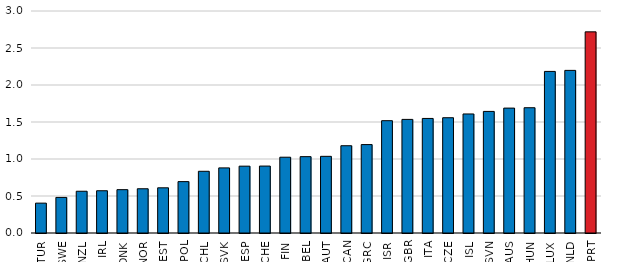
| Category | ARCR |
|---|---|
| TUR | 0.404 |
| SWE | 0.481 |
| NZL | 0.564 |
| IRL | 0.571 |
| DNK | 0.586 |
| NOR | 0.598 |
| EST | 0.611 |
| POL | 0.694 |
| CHL | 0.834 |
| SVK | 0.88 |
| ESP | 0.903 |
| CHE | 0.905 |
| FIN | 1.024 |
| BEL | 1.032 |
| AUT | 1.036 |
| CAN | 1.179 |
| GRC | 1.195 |
| ISR | 1.518 |
| GBR | 1.535 |
| ITA | 1.548 |
| CZE | 1.558 |
| ISL | 1.609 |
| SVN | 1.643 |
| AUS | 1.688 |
| HUN | 1.693 |
| LUX | 2.184 |
| NLD | 2.197 |
| PRT | 2.718 |